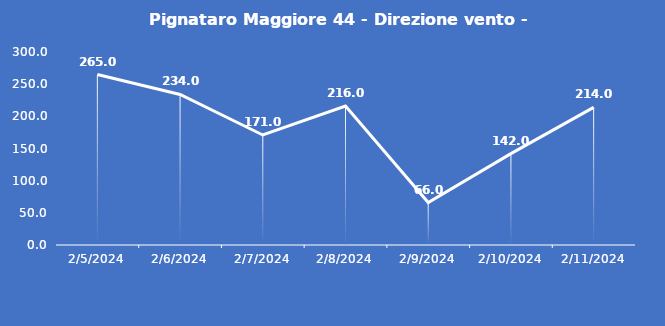
| Category | Pignataro Maggiore 44 - Direzione vento - Grezzo (°N) |
|---|---|
| 2/5/24 | 265 |
| 2/6/24 | 234 |
| 2/7/24 | 171 |
| 2/8/24 | 216 |
| 2/9/24 | 66 |
| 2/10/24 | 142 |
| 2/11/24 | 214 |